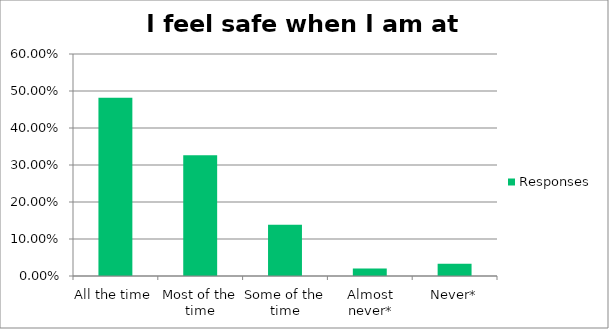
| Category | Responses |
|---|---|
| All the time | 0.482 |
| Most of the time | 0.327 |
| Some of the time | 0.139 |
| Almost never* | 0.02 |
| Never* | 0.033 |